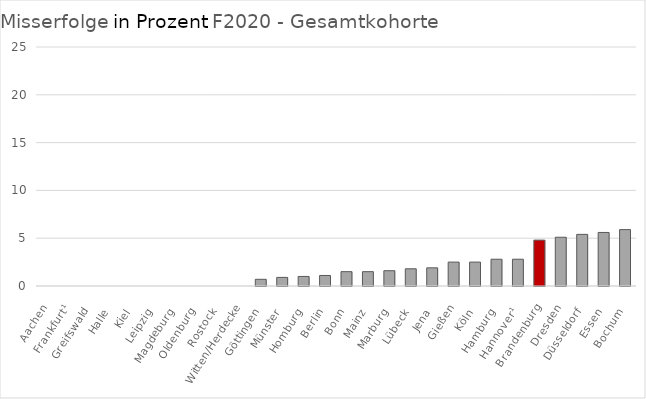
| Category | Misserfolg Ges |
|---|---|
| Aachen | 0 |
| Frankfurt¹ | 0 |
| Greifswald | 0 |
| Halle | 0 |
| Kiel | 0 |
| Leipzig | 0 |
| Magdeburg | 0 |
| Oldenburg | 0 |
| Rostock | 0 |
| Witten/Herdecke | 0 |
| Göttingen | 0.7 |
| Münster | 0.9 |
| Homburg | 1 |
| Berlin | 1.1 |
| Bonn | 1.5 |
| Mainz | 1.5 |
| Marburg | 1.6 |
| Lübeck | 1.8 |
| Jena | 1.9 |
| Gießen | 2.5 |
| Köln | 2.5 |
| Hamburg | 2.8 |
| Hannover¹ | 2.8 |
| Brandenburg | 4.8 |
| Dresden | 5.1 |
| Düsseldorf | 5.4 |
| Essen | 5.6 |
| Bochum | 5.9 |